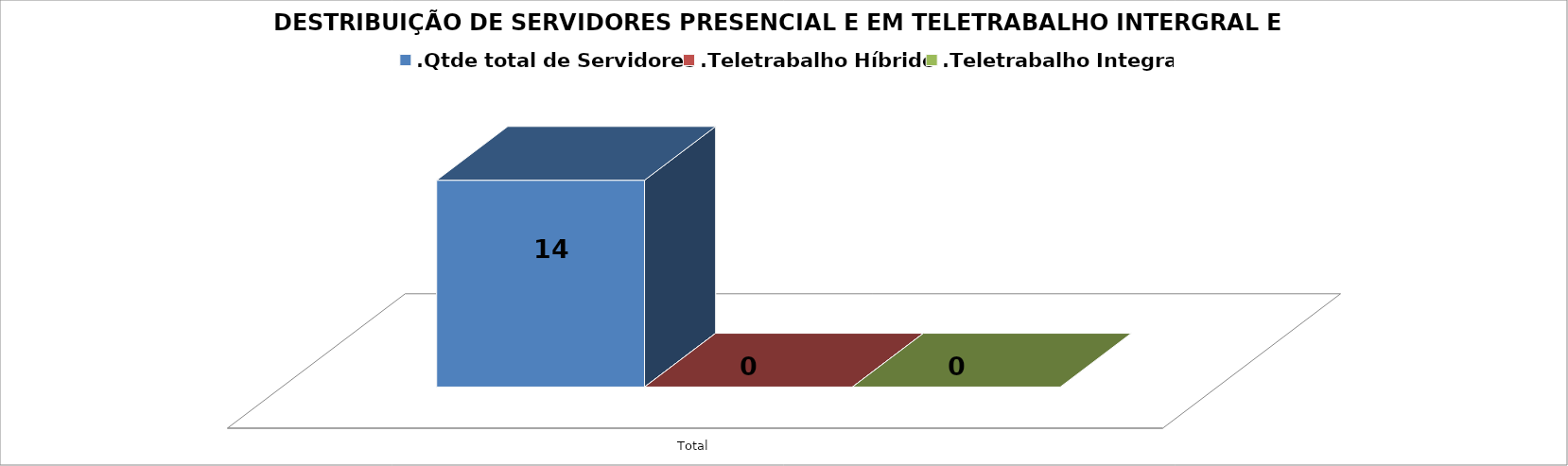
| Category | .Qtde total de Servidores | .Teletrabalho Híbrido | .Teletrabalho Integral |
|---|---|---|---|
| Total | 14 | 0 | 0 |